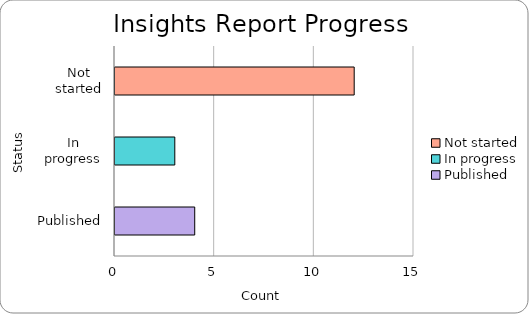
| Category | Count |
|---|---|
| Not started | 12 |
| In progress | 3 |
| Published | 4 |